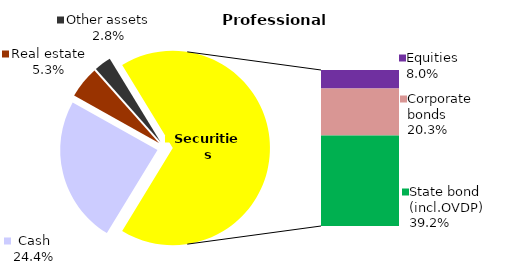
| Category | Professional |
|---|---|
| Cash | 32.407 |
| Bank metals | 0 |
| Real estate | 7.062 |
| Other assets | 3.764 |
| Equities | 10.644 |
| Corporate bonds | 26.882 |
| Municipal bonds | 0 |
| State bond (incl.OVDP) | 51.972 |